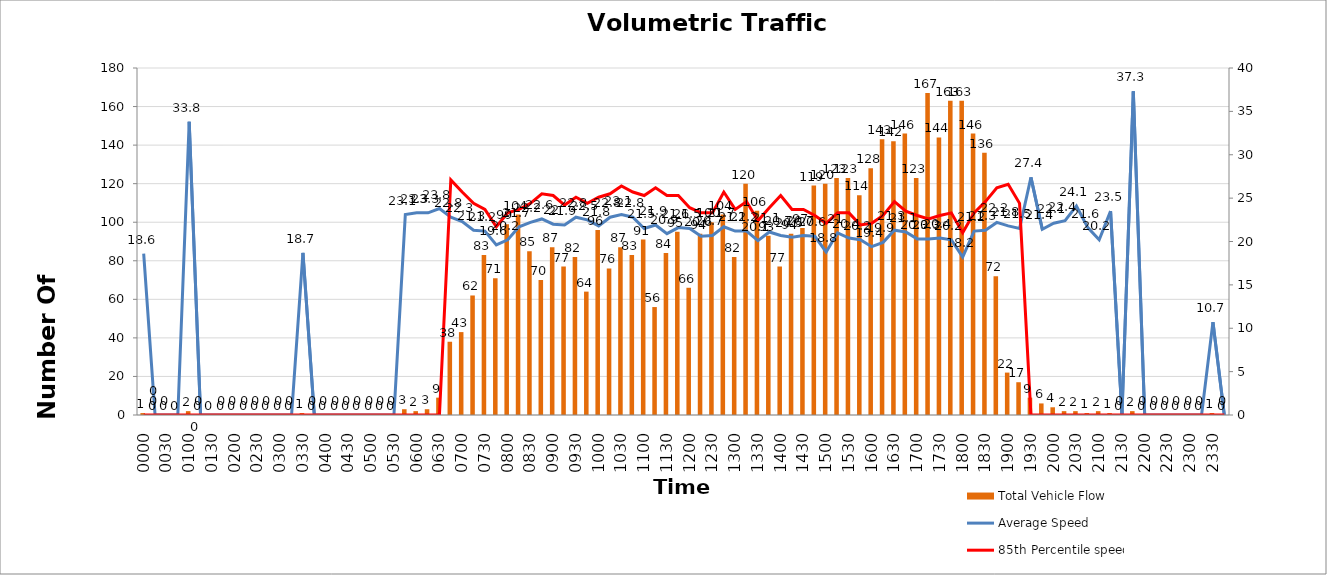
| Category | Total Vehicle Flow |
|---|---|
| 0000 | 1 |
| 0015 | 0 |
| 0030 | 0 |
| 0045 | 0 |
| 0100 | 2 |
| 0115 | 0 |
| 0130 | 0 |
| 0145 | 0 |
| 0200 | 0 |
| 0215 | 0 |
| 0230 | 0 |
| 0245 | 0 |
| 0300 | 0 |
| 0315 | 0 |
| 0330 | 1 |
| 0345 | 0 |
| 0400 | 0 |
| 0415 | 0 |
| 0430 | 0 |
| 0445 | 0 |
| 0500 | 0 |
| 0515 | 0 |
| 0530 | 0 |
| 0545 | 3 |
| 0600 | 2 |
| 0615 | 3 |
| 0630 | 9 |
| 0645 | 38 |
| 0700 | 43 |
| 0715 | 62 |
| 0730 | 83 |
| 0745 | 71 |
| 0800 | 99 |
| 0815 | 104 |
| 0830 | 85 |
| 0845 | 70 |
| 0900 | 87 |
| 0915 | 77 |
| 0930 | 82 |
| 0945 | 64 |
| 1000 | 96 |
| 1015 | 76 |
| 1030 | 87 |
| 1045 | 83 |
| 1100 | 91 |
| 1115 | 56 |
| 1130 | 84 |
| 1145 | 95 |
| 1200 | 66 |
| 1215 | 94 |
| 1230 | 100 |
| 1245 | 104 |
| 1300 | 82 |
| 1315 | 120 |
| 1330 | 106 |
| 1345 | 93 |
| 1400 | 77 |
| 1415 | 94 |
| 1430 | 97 |
| 1445 | 119 |
| 1500 | 120 |
| 1515 | 123 |
| 1530 | 123 |
| 1545 | 114 |
| 1600 | 128 |
| 1615 | 143 |
| 1630 | 142 |
| 1645 | 146 |
| 1700 | 123 |
| 1715 | 167 |
| 1730 | 144 |
| 1745 | 163 |
| 1800 | 163 |
| 1815 | 146 |
| 1830 | 136 |
| 1845 | 72 |
| 1900 | 22 |
| 1915 | 17 |
| 1930 | 9 |
| 1945 | 6 |
| 2000 | 4 |
| 2015 | 2 |
| 2030 | 2 |
| 2045 | 1 |
| 2100 | 2 |
| 2115 | 1 |
| 2130 | 0 |
| 2145 | 2 |
| 2200 | 0 |
| 2215 | 0 |
| 2230 | 0 |
| 2245 | 0 |
| 2300 | 0 |
| 2315 | 0 |
| 2330 | 1 |
| 2345 | 0 |